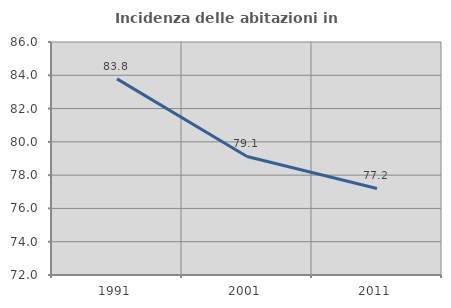
| Category | Incidenza delle abitazioni in proprietà  |
|---|---|
| 1991.0 | 83.784 |
| 2001.0 | 79.121 |
| 2011.0 | 77.202 |